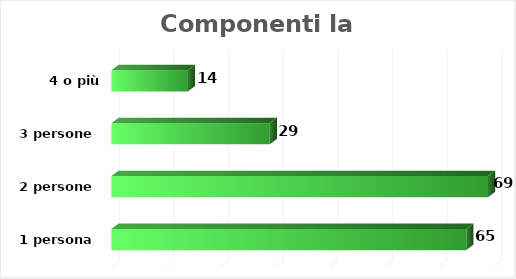
| Category | Componenti la famiglia |
|---|---|
| 1 persona | 65 |
| 2 persone | 69 |
| 3 persone | 29 |
| 4 o più pers | 14 |